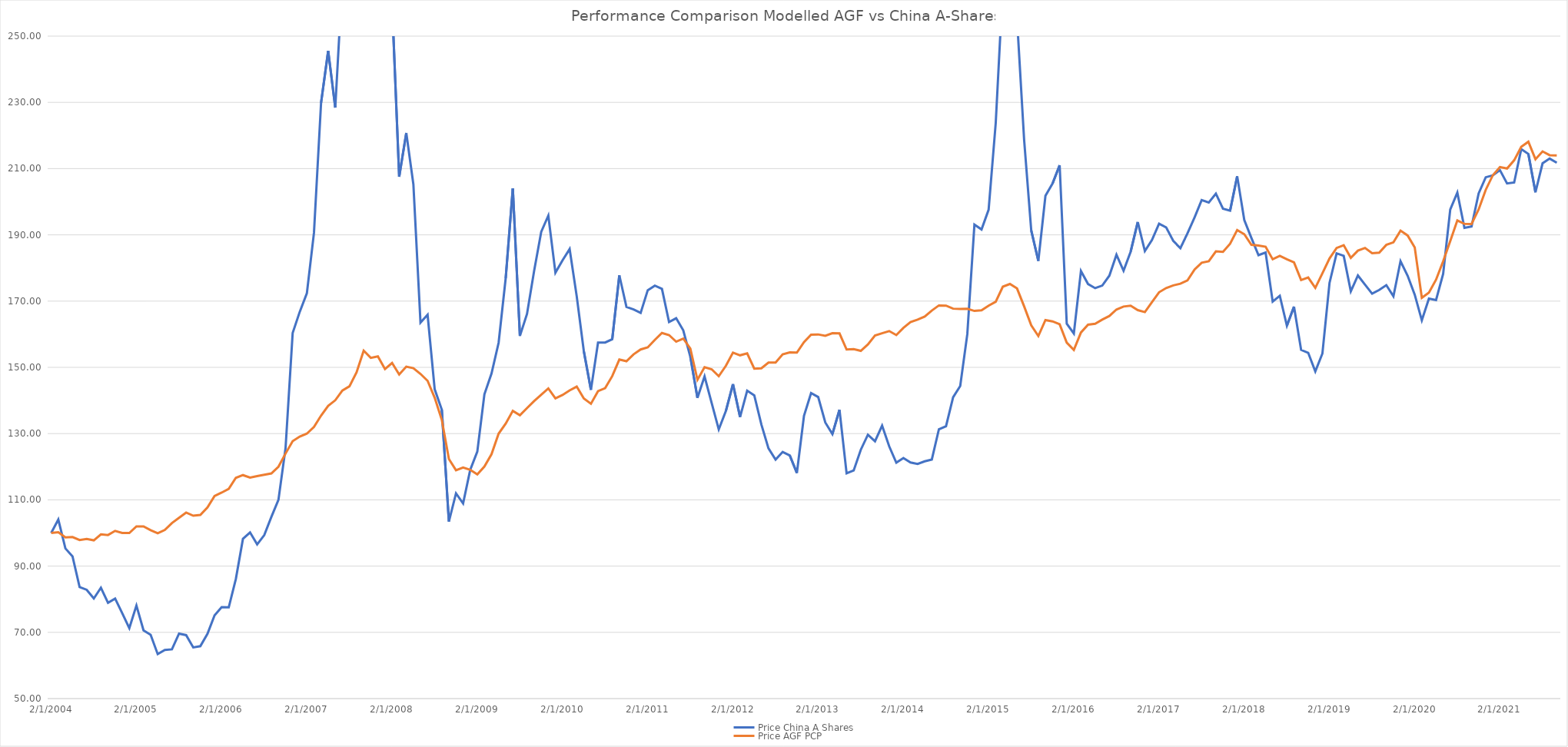
| Category | Price China A Shares | Price AGF PCP |
|---|---|---|
| 10/31/21 | 211.79 | 213.993 |
| 9/30/21 | 213.029 | 214.061 |
| 8/31/21 | 211.591 | 215.198 |
| 7/31/21 | 202.842 | 212.844 |
| 6/30/21 | 214.432 | 218.112 |
| 5/31/21 | 215.89 | 216.565 |
| 4/30/21 | 205.808 | 212.506 |
| 3/31/21 | 205.518 | 210.023 |
| 2/28/21 | 209.537 | 210.487 |
| 1/31/21 | 207.981 | 208.014 |
| 12/31/20 | 207.384 | 203.605 |
| 11/30/20 | 202.528 | 197.685 |
| 10/31/20 | 192.519 | 193.293 |
| 9/30/20 | 192.124 | 193.32 |
| 8/31/20 | 202.742 | 194.366 |
| 7/31/20 | 197.64 | 188.094 |
| 6/30/20 | 178.216 | 182.021 |
| 5/31/20 | 170.321 | 176.457 |
| 4/30/20 | 170.76 | 172.573 |
| 3/31/20 | 164.191 | 170.991 |
| 2/29/20 | 171.945 | 186.221 |
| 1/31/20 | 177.673 | 189.809 |
| 12/31/19 | 182.063 | 191.27 |
| 11/30/19 | 171.436 | 187.741 |
| 10/31/19 | 174.813 | 186.977 |
| 9/30/19 | 173.368 | 184.643 |
| 8/31/19 | 172.249 | 184.464 |
| 7/31/19 | 174.985 | 186.045 |
| 6/30/19 | 177.734 | 185.232 |
| 5/31/19 | 172.951 | 183.063 |
| 4/30/19 | 183.66 | 186.863 |
| 3/31/19 | 184.411 | 186.043 |
| 2/28/19 | 175.462 | 182.881 |
| 1/31/19 | 154.184 | 178.373 |
| 12/31/18 | 148.761 | 173.99 |
| 11/30/18 | 154.388 | 177.112 |
| 10/31/18 | 155.271 | 176.356 |
| 9/30/18 | 168.321 | 181.686 |
| 8/31/18 | 162.576 | 182.618 |
| 7/31/18 | 171.61 | 183.668 |
| 6/30/18 | 169.873 | 182.622 |
| 5/31/18 | 184.691 | 186.411 |
| 4/30/18 | 183.882 | 186.772 |
| 3/31/18 | 189.054 | 187.001 |
| 2/28/18 | 194.468 | 190.194 |
| 1/31/18 | 207.688 | 191.434 |
| 12/31/17 | 197.301 | 187.309 |
| 11/30/17 | 197.901 | 184.86 |
| 10/31/17 | 202.442 | 185.028 |
| 9/30/17 | 199.765 | 182.027 |
| 8/31/17 | 200.505 | 181.592 |
| 7/31/17 | 195.269 | 179.514 |
| 6/30/17 | 190.46 | 176.252 |
| 5/31/17 | 185.968 | 175.247 |
| 4/30/17 | 188.185 | 174.741 |
| 3/31/17 | 192.242 | 173.94 |
| 2/28/17 | 193.372 | 172.678 |
| 1/31/17 | 188.448 | 169.717 |
| 12/31/16 | 185.117 | 166.687 |
| 11/30/16 | 193.869 | 167.276 |
| 10/31/16 | 184.927 | 168.606 |
| 9/30/16 | 179.168 | 168.362 |
| 8/31/16 | 184.004 | 167.461 |
| 7/31/16 | 177.672 | 165.515 |
| 6/30/16 | 174.687 | 164.419 |
| 5/31/16 | 173.905 | 163.164 |
| 4/30/16 | 175.164 | 162.888 |
| 3/31/16 | 179.077 | 160.518 |
| 2/29/16 | 160.235 | 155.286 |
| 1/31/16 | 163.194 | 157.459 |
| 12/31/15 | 211.02 | 163.004 |
| 11/30/15 | 205.5 | 163.881 |
| 10/31/15 | 201.783 | 164.273 |
| 9/30/15 | 182.142 | 159.455 |
| 8/31/15 | 191.339 | 162.671 |
| 7/31/15 | 218.64 | 168.416 |
| 6/30/15 | 255.203 | 173.816 |
| 5/31/15 | 275.097 | 175.171 |
| 4/30/15 | 265.111 | 174.35 |
| 3/31/15 | 223.777 | 169.797 |
| 2/28/15 | 197.599 | 168.636 |
| 1/31/15 | 191.627 | 167.214 |
| 12/31/14 | 193.081 | 167.03 |
| 11/30/14 | 160.054 | 167.666 |
| 10/31/14 | 144.356 | 167.619 |
| 9/30/14 | 140.968 | 167.717 |
| 8/31/14 | 132.218 | 168.646 |
| 7/31/14 | 131.319 | 168.702 |
| 6/30/14 | 122.178 | 167.153 |
| 5/31/14 | 121.628 | 165.338 |
| 4/30/14 | 120.849 | 164.395 |
| 3/31/14 | 121.269 | 163.648 |
| 2/28/14 | 122.637 | 161.915 |
| 1/31/14 | 121.202 | 159.758 |
| 12/31/13 | 126.151 | 160.961 |
| 11/30/13 | 132.409 | 160.309 |
| 10/31/13 | 127.698 | 159.605 |
| 9/30/13 | 129.67 | 156.928 |
| 8/31/13 | 125.12 | 154.986 |
| 7/31/13 | 118.872 | 155.501 |
| 6/30/13 | 117.992 | 155.398 |
| 5/31/13 | 137.189 | 160.257 |
| 4/30/13 | 129.857 | 160.315 |
| 3/31/13 | 133.353 | 159.531 |
| 2/28/13 | 141.047 | 159.944 |
| 1/31/13 | 142.235 | 159.859 |
| 12/31/12 | 135.354 | 157.601 |
| 11/30/12 | 118.105 | 154.46 |
| 10/31/12 | 123.417 | 154.523 |
| 9/30/12 | 124.454 | 153.913 |
| 8/31/12 | 122.153 | 151.437 |
| 7/31/12 | 125.547 | 151.423 |
| 6/30/12 | 132.76 | 149.724 |
| 5/31/12 | 141.556 | 149.614 |
| 4/30/12 | 142.969 | 154.228 |
| 3/31/12 | 135.014 | 153.641 |
| 2/29/12 | 144.916 | 154.43 |
| 1/31/12 | 136.826 | 150.446 |
| 12/31/11 | 131.257 | 147.333 |
| 11/30/11 | 139.251 | 149.426 |
| 10/31/11 | 147.264 | 150.064 |
| 9/30/11 | 140.769 | 146.236 |
| 8/31/11 | 153.187 | 155.632 |
| 7/31/11 | 161.184 | 158.698 |
| 6/30/11 | 164.833 | 157.759 |
| 5/31/11 | 163.668 | 159.753 |
| 4/30/11 | 173.701 | 160.393 |
| 3/31/11 | 174.654 | 158.308 |
| 2/28/11 | 173.278 | 156.03 |
| 1/31/11 | 166.445 | 155.406 |
| 12/31/10 | 167.495 | 153.911 |
| 11/30/10 | 168.24 | 151.846 |
| 10/31/10 | 177.78 | 152.366 |
| 9/30/10 | 158.481 | 147.351 |
| 8/31/10 | 157.489 | 143.718 |
| 7/31/10 | 157.475 | 142.815 |
| 6/30/10 | 143.222 | 139.008 |
| 5/31/10 | 154.858 | 140.593 |
| 4/30/10 | 171.432 | 144.184 |
| 3/31/10 | 185.71 | 143.037 |
| 2/28/10 | 182.295 | 141.664 |
| 1/31/10 | 178.575 | 140.649 |
| 12/31/09 | 195.819 | 143.65 |
| 11/30/09 | 190.922 | 141.745 |
| 10/31/09 | 179.095 | 139.823 |
| 9/30/09 | 166.155 | 137.711 |
| 8/31/09 | 159.476 | 135.526 |
| 7/31/09 | 204.045 | 136.858 |
| 6/30/09 | 176.97 | 133.017 |
| 5/31/09 | 157.428 | 129.978 |
| 4/30/09 | 148.147 | 123.782 |
| 3/31/09 | 141.886 | 120.048 |
| 2/28/09 | 124.564 | 117.7 |
| 1/31/09 | 119.054 | 119.082 |
| 12/31/08 | 108.908 | 119.756 |
| 11/30/08 | 111.949 | 118.929 |
| 10/31/08 | 103.468 | 122.326 |
| 9/30/08 | 137.225 | 134.162 |
| 8/31/08 | 143.372 | 140.824 |
| 7/31/08 | 165.866 | 145.935 |
| 6/30/08 | 163.489 | 148.026 |
| 5/31/08 | 205.23 | 149.761 |
| 4/30/08 | 220.757 | 150.216 |
| 3/31/08 | 207.542 | 147.836 |
| 2/29/08 | 259.924 | 151.333 |
| 1/31/08 | 262.052 | 149.495 |
| 12/31/07 | 314.538 | 153.3 |
| 11/30/07 | 291.219 | 152.878 |
| 10/31/07 | 356.126 | 155.035 |
| 9/30/07 | 331.98 | 148.517 |
| 8/31/07 | 312.181 | 144.28 |
| 7/31/07 | 267.119 | 143.014 |
| 6/30/07 | 228.433 | 140.066 |
| 5/31/07 | 245.523 | 138.396 |
| 4/30/07 | 229.864 | 135.437 |
| 3/31/07 | 190.629 | 131.996 |
| 2/28/07 | 172.366 | 129.994 |
| 1/31/07 | 166.787 | 129.094 |
| 12/31/06 | 160.367 | 127.73 |
| 11/30/06 | 125.673 | 123.986 |
| 10/31/06 | 110.012 | 120.016 |
| 9/30/06 | 104.836 | 117.98 |
| 8/31/06 | 99.333 | 117.564 |
| 7/31/06 | 96.566 | 117.179 |
| 6/30/06 | 100.15 | 116.737 |
| 5/31/06 | 98.229 | 117.467 |
| 4/30/06 | 86.116 | 116.648 |
| 3/31/06 | 77.55 | 113.312 |
| 2/28/06 | 77.619 | 112.191 |
| 1/31/06 | 75.133 | 111.148 |
| 12/31/05 | 69.552 | 107.699 |
| 11/30/05 | 65.824 | 105.442 |
| 10/31/05 | 65.447 | 105.215 |
| 9/30/05 | 69.157 | 106.153 |
| 8/31/05 | 69.622 | 104.576 |
| 7/31/05 | 64.867 | 102.985 |
| 6/30/05 | 64.664 | 100.908 |
| 5/31/05 | 63.42 | 99.907 |
| 4/30/05 | 69.283 | 100.832 |
| 3/31/05 | 70.597 | 101.983 |
| 2/28/05 | 78.099 | 101.992 |
| 1/31/05 | 71.273 | 99.981 |
| 12/31/04 | 75.776 | 100.005 |
| 11/30/04 | 80.193 | 100.627 |
| 10/31/04 | 78.936 | 99.392 |
| 9/30/04 | 83.466 | 99.575 |
| 8/31/04 | 80.216 | 97.789 |
| 7/31/04 | 82.846 | 98.192 |
| 6/30/04 | 83.674 | 97.882 |
| 5/31/04 | 92.949 | 98.78 |
| 4/30/04 | 95.328 | 98.672 |
| 3/31/04 | 104.049 | 100.215 |
| 2/29/04 | 100 | 100 |